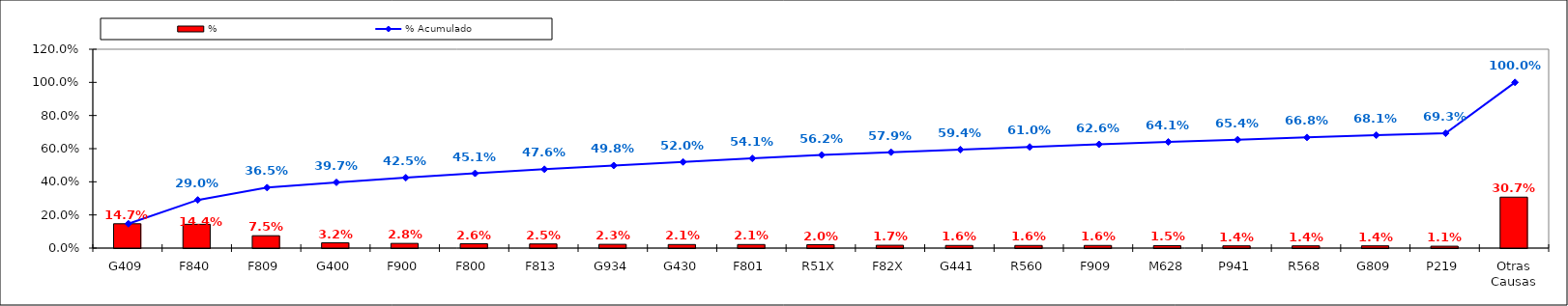
| Category | % |
|---|---|
| G409 | 0.147 |
| F840 | 0.144 |
| F809 | 0.075 |
| G400 | 0.032 |
| F900 | 0.028 |
| F800 | 0.026 |
| F813 | 0.025 |
| G934 | 0.023 |
| G430 | 0.021 |
| F801 | 0.021 |
| R51X | 0.02 |
| F82X | 0.017 |
| G441 | 0.016 |
| R560 | 0.016 |
| F909 | 0.016 |
| M628 | 0.015 |
| P941 | 0.014 |
| R568 | 0.014 |
| G809 | 0.014 |
| P219 | 0.011 |
| Otras Causas | 0.307 |